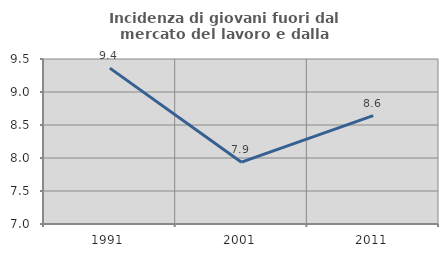
| Category | Incidenza di giovani fuori dal mercato del lavoro e dalla formazione  |
|---|---|
| 1991.0 | 9.362 |
| 2001.0 | 7.937 |
| 2011.0 | 8.642 |